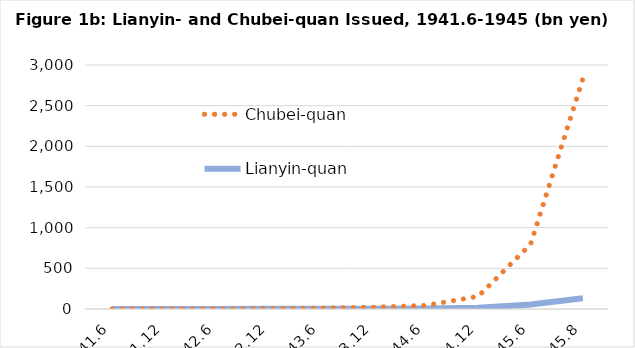
| Category | Lianyin-quan | Chubei-quan |
|---|---|---|
| 1941.6 | 690775 | 64631 |
| 1941.12 | 963962 | 237316 |
| 1942.6 | 937309 | 1172365 |
| 1942.12 | 1581008 | 3477345 |
| 1943.6 | 1949449 | 9122239 |
| 1943.12 | 3761583 | 19150328 |
| 1944.6 | 5994792 | 38358917 |
| 1944.12 | 15840886 | 139698667 |
| 1945.6 | 55390530 | 738722692 |
| 1945.8 | 132603000 | 2697231000 |